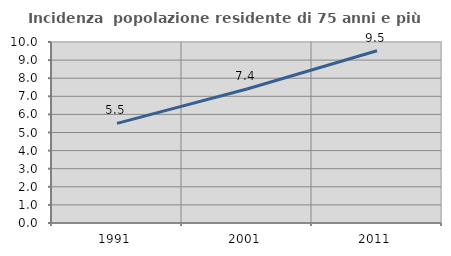
| Category | Incidenza  popolazione residente di 75 anni e più |
|---|---|
| 1991.0 | 5.502 |
| 2001.0 | 7.404 |
| 2011.0 | 9.513 |